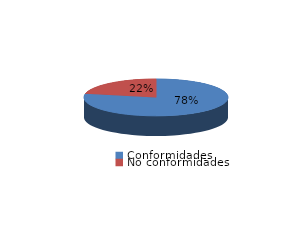
| Category | Series 0 |
|---|---|
| Conformidades | 1389 |
| No conformidades | 390 |